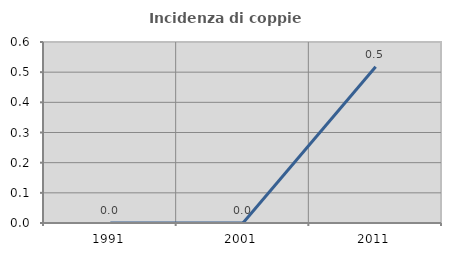
| Category | Incidenza di coppie miste |
|---|---|
| 1991.0 | 0 |
| 2001.0 | 0 |
| 2011.0 | 0.518 |